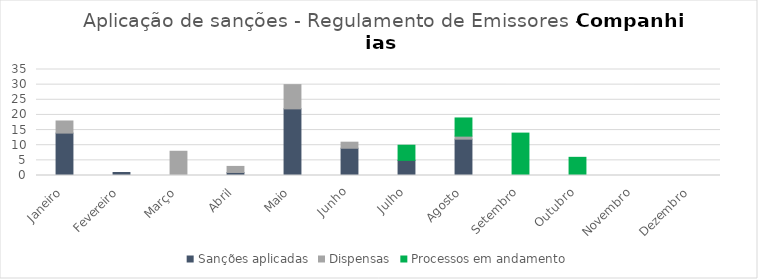
| Category | Sanções aplicadas | Dispensas | Processos em andamento |
|---|---|---|---|
| Janeiro | 14 | 4 | 0 |
| Fevereiro | 1 | 0 | 0 |
| Março | 0 | 8 | 0 |
| Abril | 1 | 2 | 0 |
| Maio | 22 | 8 | 0 |
| Junho | 9 | 2 | 0 |
| Julho | 5 | 0 | 5 |
| Agosto | 12 | 1 | 6 |
| Setembro | 0 | 0 | 14 |
| Outubro | 0 | 0 | 6 |
| Novembro | 0 | 0 | 0 |
| Dezembro | 0 | 0 | 0 |